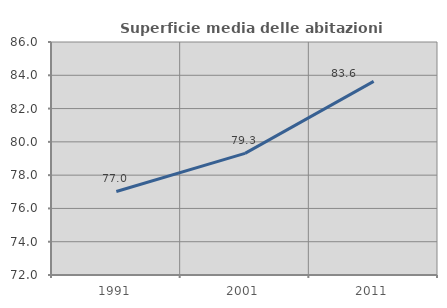
| Category | Superficie media delle abitazioni occupate |
|---|---|
| 1991.0 | 77.019 |
| 2001.0 | 79.311 |
| 2011.0 | 83.632 |